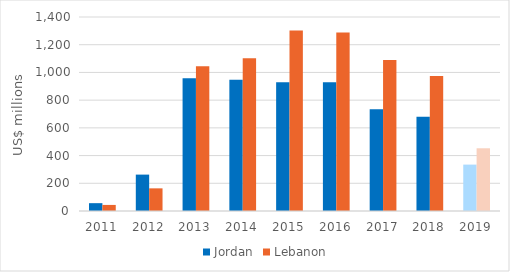
| Category | Jordan | Lebanon |
|---|---|---|
| 2011.0 | 56.538 | 43.813 |
| 2012.0 | 262.649 | 163.449 |
| 2013.0 | 958.546 | 1044.927 |
| 2014.0 | 947.356 | 1102.665 |
| 2015.0 | 929.601 | 1302.557 |
| 2016.0 | 928.348 | 1288.819 |
| 2017.0 | 734.615 | 1089.219 |
| 2018.0 | 679.253 | 973.346 |
| 2019.0 | 334.792 | 452.625 |